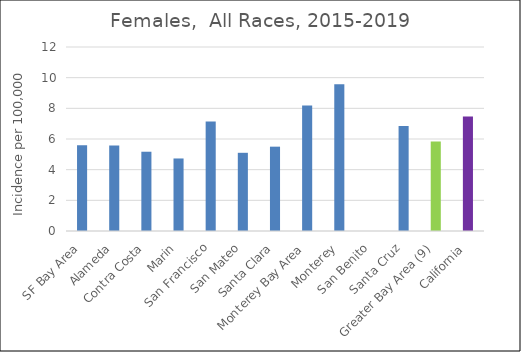
| Category | Female |
|---|---|
| SF Bay Area | 5.6 |
|   Alameda | 5.57 |
|   Contra Costa | 5.17 |
|   Marin | 4.73 |
|   San Francisco | 7.14 |
|   San Mateo | 5.1 |
|   Santa Clara | 5.5 |
| Monterey Bay Area | 8.18 |
|   Monterey | 9.57 |
|   San Benito | 0 |
|   Santa Cruz | 6.84 |
| Greater Bay Area (9) | 5.84 |
| California | 7.46 |